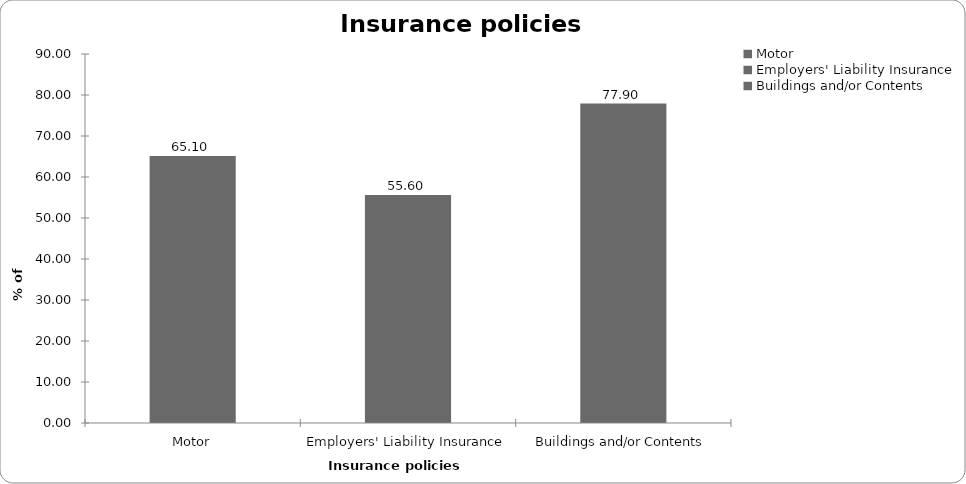
| Category | Insurance policies held |
|---|---|
| Motor | 65.1 |
| Employers' Liability Insurance | 55.6 |
| Buildings and/or Contents | 77.9 |